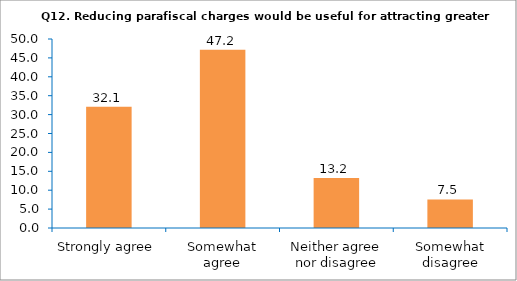
| Category | Series 0 |
|---|---|
| Strongly agree | 32.075 |
| Somewhat agree | 47.17 |
| Neither agree nor disagree | 13.208 |
| Somewhat disagree | 7.547 |